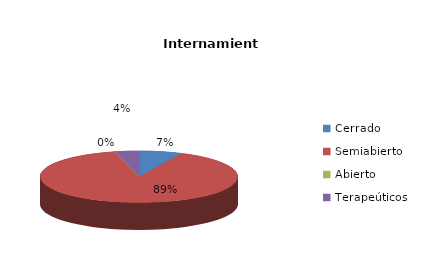
| Category | Series 0 |
|---|---|
| Cerrado | 18 |
| Semiabierto | 228 |
| Abierto | 0 |
| Terapeúticos | 10 |